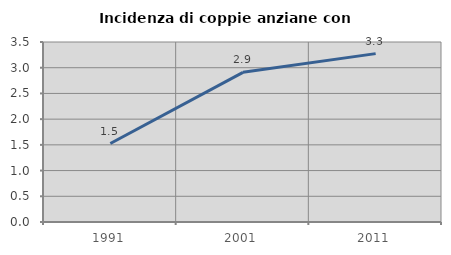
| Category | Incidenza di coppie anziane con figli |
|---|---|
| 1991.0 | 1.525 |
| 2001.0 | 2.91 |
| 2011.0 | 3.274 |